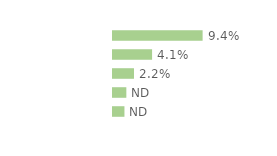
| Category | Series 0 |
|---|---|
| 18-29 ans | 0.094 |
| 30-39 ans | 0.041 |
| 40-49 ans | 0.022 |
| 50-59 ans | 0.014 |
| 60-75 ans | 0.012 |